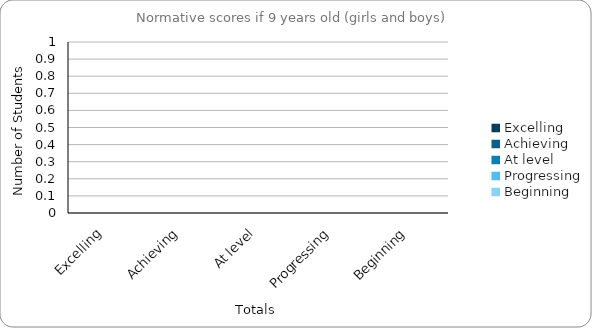
| Category | If 9 years old |
|---|---|
| Excelling | 0 |
| Achieving | 0 |
| At level | 0 |
| Progressing | 0 |
| Beginning | 0 |